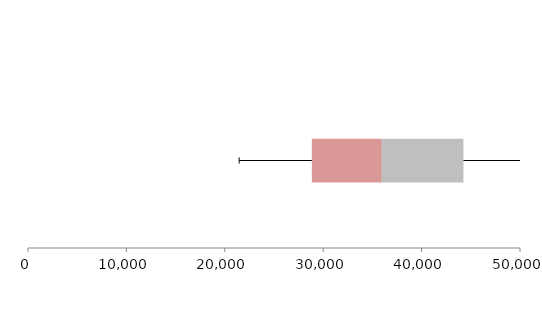
| Category | Series 1 | Series 2 | Series 3 |
|---|---|---|---|
| 0 | 28846.762 | 7108.752 | 8294.754 |